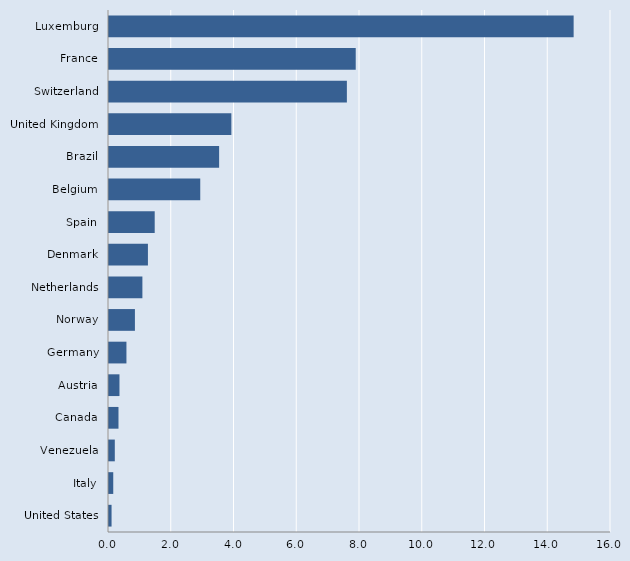
| Category | Series 0 |
|---|---|
| United States | 0.082 |
| Italy | 0.135 |
| Venezuela | 0.185 |
| Canada | 0.302 |
| Austria | 0.334 |
| Germany | 0.556 |
| Norway | 0.826 |
| Netherlands | 1.064 |
| Denmark | 1.241 |
| Spain | 1.457 |
| Belgium | 2.908 |
| Brazil | 3.51 |
| United Kingdom | 3.9 |
| Switzerland | 7.582 |
| France | 7.864 |
| Luxemburg | 14.809 |